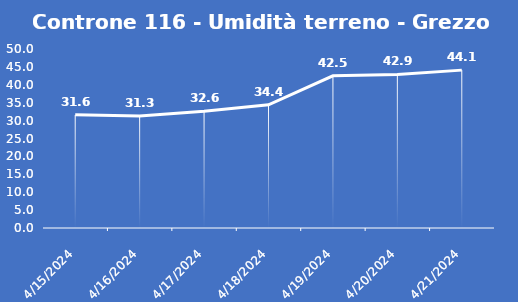
| Category | Controne 116 - Umidità terreno - Grezzo (%VWC) |
|---|---|
| 4/15/24 | 31.6 |
| 4/16/24 | 31.3 |
| 4/17/24 | 32.6 |
| 4/18/24 | 34.4 |
| 4/19/24 | 42.5 |
| 4/20/24 | 42.9 |
| 4/21/24 | 44.1 |